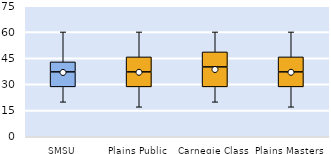
| Category | 25th | 50th | 75th |
|---|---|---|---|
| SMSU | 28.571 | 8.571 | 5.714 |
| Plains Public | 28.571 | 8.571 | 8.571 |
| Carnegie Class | 28.571 | 11.429 | 8.571 |
| Plains Masters | 28.571 | 8.571 | 8.571 |